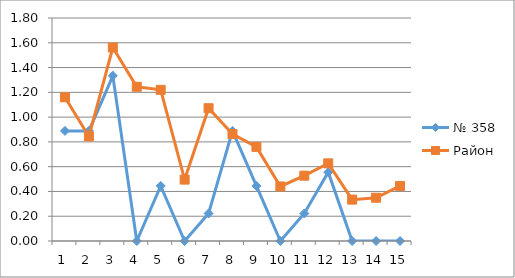
| Category | № 358 | Район |
|---|---|---|
| 0 | 0.889 | 1.16 |
| 1 | 0.889 | 0.844 |
| 2 | 1.333 | 1.562 |
| 3 | 0 | 1.245 |
| 4 | 0.444 | 1.22 |
| 5 | 0 | 0.496 |
| 6 | 0.222 | 1.072 |
| 7 | 0.889 | 0.863 |
| 8 | 0.444 | 0.76 |
| 9 | 0 | 0.44 |
| 10 | 0.222 | 0.527 |
| 11 | 0.556 | 0.627 |
| 12 | 0 | 0.334 |
| 13 | 0 | 0.349 |
| 14 | 0 | 0.445 |